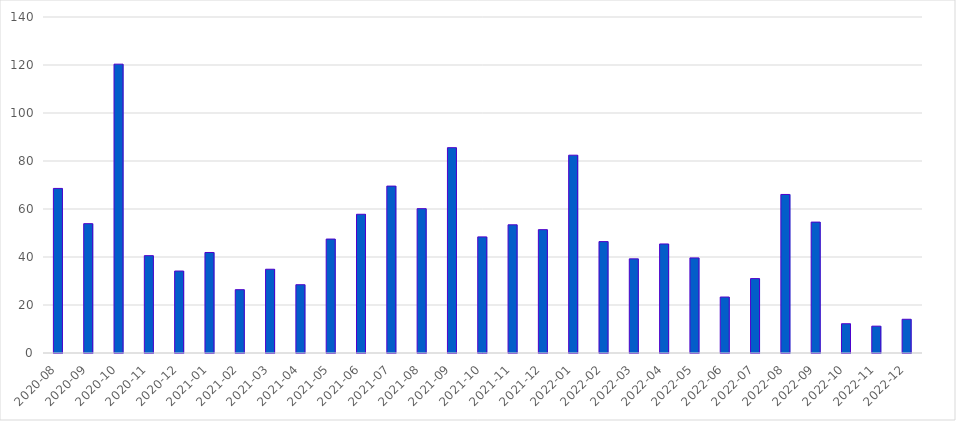
| Category | Series 0 |
|---|---|
| 2020-08 | 68.57 |
| 2020-09 | 53.89 |
| 2020-10 | 120.35 |
| 2020-11 | 40.56 |
| 2020-12 | 34.15 |
| 2021-01 | 41.88 |
| 2021-02 | 26.38 |
| 2021-03 | 34.9 |
| 2021-04 | 28.45 |
| 2021-05 | 47.48 |
| 2021-06 | 57.8 |
| 2021-07 | 69.54 |
| 2021-08 | 60.14 |
| 2021-09 | 85.55 |
| 2021-10 | 48.38 |
| 2021-11 | 53.41 |
| 2021-12 | 51.39 |
| 2022-01 | 82.42 |
| 2022-02 | 46.41 |
| 2022-03 | 39.22 |
| 2022-04 | 45.43 |
| 2022-05 | 39.62 |
| 2022-06 | 23.32 |
| 2022-07 | 31 |
| 2022-08 | 66.06 |
| 2022-09 | 54.54 |
| 2022-10 | 12.19 |
| 2022-11 | 11.18 |
| 2022-12 | 14.05 |